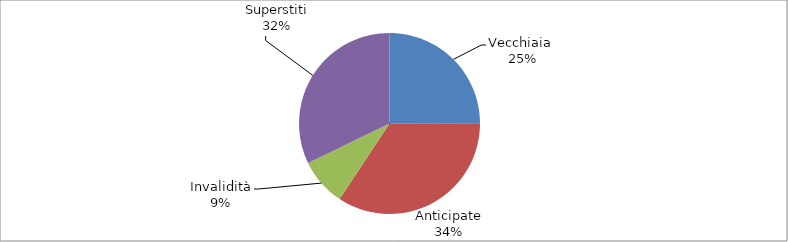
| Category | Series 0 |
|---|---|
| Vecchiaia  | 82809 |
| Anticipate | 114000 |
| Invalidità | 28358 |
| Superstiti | 106792 |